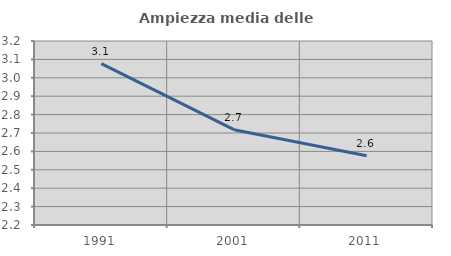
| Category | Ampiezza media delle famiglie |
|---|---|
| 1991.0 | 3.077 |
| 2001.0 | 2.718 |
| 2011.0 | 2.576 |